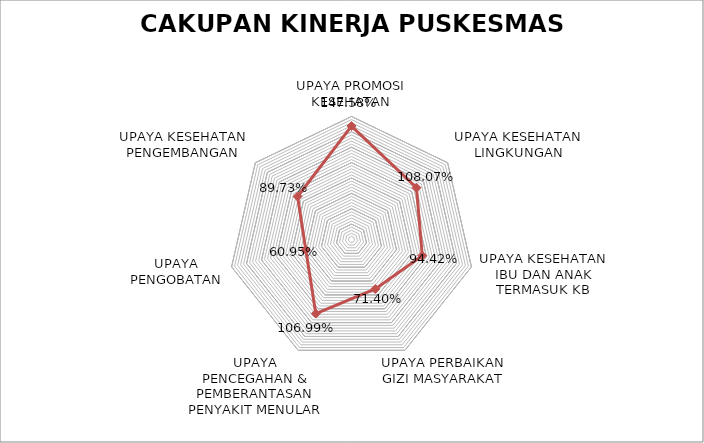
| Category | Series 0 |
|---|---|
| UPAYA PROMOSI KESEHATAN | 1.476 |
| UPAYA KESEHATAN LINGKUNGAN | 1.081 |
| UPAYA KESEHATAN IBU DAN ANAK TERMASUK KB | 0.944 |
| UPAYA PERBAIKAN GIZI MASYARAKAT | 0.714 |
| UPAYA PENCEGAHAN & PEMBERANTASAN PENYAKIT MENULAR | 1.07 |
| UPAYA PENGOBATAN | 0.609 |
| UPAYA KESEHATAN PENGEMBANGAN | 0.897 |